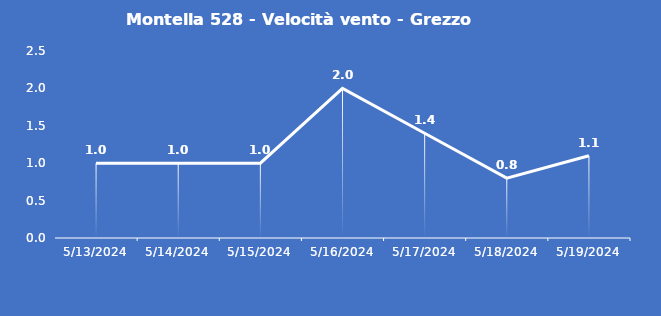
| Category | Montella 528 - Velocità vento - Grezzo (m/s) |
|---|---|
| 5/13/24 | 1 |
| 5/14/24 | 1 |
| 5/15/24 | 1 |
| 5/16/24 | 2 |
| 5/17/24 | 1.4 |
| 5/18/24 | 0.8 |
| 5/19/24 | 1.1 |